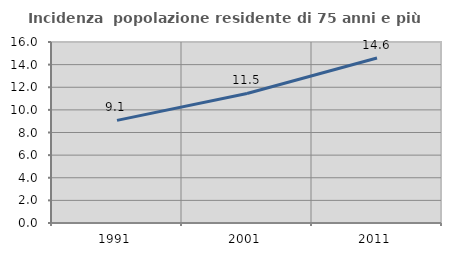
| Category | Incidenza  popolazione residente di 75 anni e più |
|---|---|
| 1991.0 | 9.07 |
| 2001.0 | 11.453 |
| 2011.0 | 14.588 |